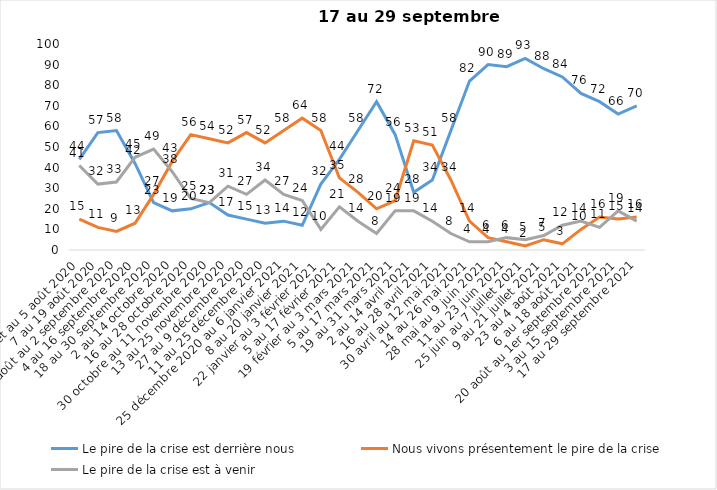
| Category | Le pire de la crise est derrière nous | Nous vivons présentement le pire de la crise | Le pire de la crise est à venir |
|---|---|---|---|
| 24 juillet au 5 août 2020 | 44 | 15 | 41 |
| 7 au 19 août 2020 | 57 | 11 | 32 |
| 21 août au 2 septembre 2020 | 58 | 9 | 33 |
| 4 au 16 septembre 2020 | 42 | 13 | 45 |
| 18 au 30 septembre 2020 | 23 | 27 | 49 |
| 2 au 14 octobre 2020 | 19 | 43 | 38 |
| 16 au 28 octobre 2020 | 20 | 56 | 25 |
| 30 octobre au 11 novembre 2020 | 23 | 54 | 23 |
| 13 au 25 novembre 2020 | 17 | 52 | 31 |
| 27 au 9 décembre 2020 | 15 | 57 | 27 |
| 11 au 25 décembre 2020 | 13 | 52 | 34 |
| 25 décembre 2020 au 6 janvier 2021 | 14 | 58 | 27 |
| 8 au 20 janvier 2021 | 12 | 64 | 24 |
| 22 janvier au 3 février 2021 | 32 | 58 | 10 |
| 5 au 17 février 2021 | 44 | 35 | 21 |
| 19 février au 3 mars 2021 | 58 | 28 | 14 |
| 5 au 17 mars 2021 | 72 | 20 | 8 |
| 19 au 31 mars 2021 | 56 | 24 | 19 |
| 2 au 14 avril 2021 | 28 | 53 | 19 |
| 16 au 28 avril 2021 | 34 | 51 | 14 |
| 30 avril au 12 mai 2021 | 58 | 34 | 8 |
| 14 au 26 mai 2021 | 82 | 14 | 4 |
| 28 mai au 9 juin 2021 | 90 | 6 | 4 |
| 11 au 23 juin 2021 | 89 | 4 | 6 |
| 25 juin au 7 juillet 2021 | 93 | 2 | 5 |
| 9 au 21 juillet 2021 | 88 | 5 | 7 |
| 23 au 4 août 2021 | 84 | 3 | 12 |
| 6 au 18 août 2021 | 76 | 10 | 14 |
| 20 août au 1er septembre 2021 | 72 | 16 | 11 |
| 3 au 15 septembre 2021 | 66 | 15 | 19 |
| 17 au 29 septembre 2021 | 70 | 16 | 14 |